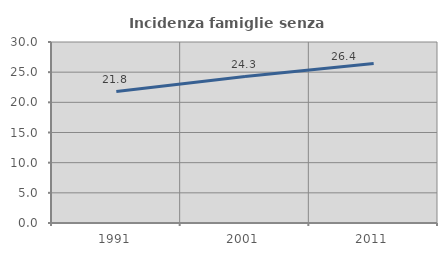
| Category | Incidenza famiglie senza nuclei |
|---|---|
| 1991.0 | 21.786 |
| 2001.0 | 24.265 |
| 2011.0 | 26.418 |